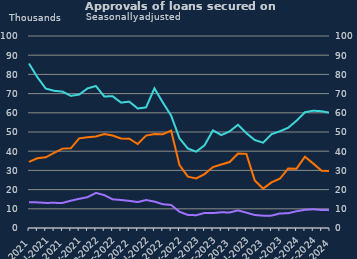
| Category | Remortgaging | Other |
|---|---|---|
| May-2021 | 34442 | 13467 |
| Jun-2021 | 36335 | 13336 |
| Jul-2021 | 36837 | 13077 |
| Aug-2021 | 39087 | 13096 |
| Sep-2021 | 41342 | 13054 |
| Oct-2021 | 41499 | 14215 |
| Nov-2021 | 46679 | 15207 |
| Dec-2021 | 47288 | 16064 |
| Jan-2022 | 47643 | 18293 |
| Feb-2022 | 48981 | 17125 |
| Mar-2022 | 48141 | 14931 |
| Apr-2022 | 46665 | 14594 |
| May-2022 | 46543 | 14124 |
| Jun-2022 | 43744 | 13506 |
| Jul-2022 | 48103 | 14571 |
| Aug-2022 | 48947 | 13772 |
| Sep-2022 | 48841 | 12383 |
| Oct-2022 | 50696 | 12001 |
| Nov-2022 | 32712 | 8449 |
| Dec-2022 | 26720 | 6803 |
| Jan-2023 | 25795 | 6663 |
| Feb-2023 | 28074 | 7832 |
| Mar-2023 | 31731 | 7757 |
| Apr-2023 | 33082 | 8181 |
| May-2023 | 34336 | 8079 |
| Jun-2023 | 38780 | 9152 |
| Jul-2023 | 38611 | 7991 |
| Aug-2023 | 24813 | 6771 |
| Sep-2023 | 20533 | 6427 |
| Oct-2023 | 23742 | 6447 |
| Nov-2023 | 25630 | 7537 |
| Dec-2023 | 30960 | 7704 |
| Jan-2024 | 30900 | 8741 |
| Feb-2024 | 37159 | 9477 |
| Mar-2024 | 33526 | 9734 |
| Apr-2024 | 29861 | 9365 |
| May-2024 | 29615 | 9296 |